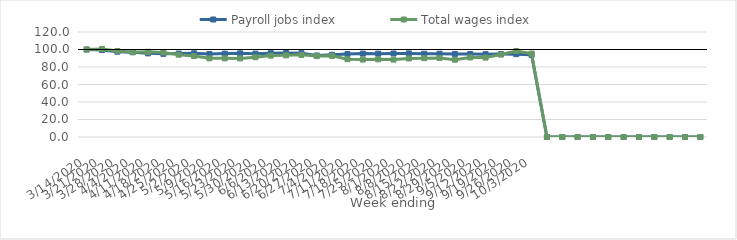
| Category | Payroll jobs index | Total wages index |
|---|---|---|
| 14/03/2020 | 100 | 100 |
| 21/03/2020 | 99.359 | 100.666 |
| 28/03/2020 | 97.508 | 98.218 |
| 04/04/2020 | 96.931 | 96.989 |
| 11/04/2020 | 95.594 | 97.424 |
| 18/04/2020 | 95.026 | 96.581 |
| 25/04/2020 | 95.434 | 94.1 |
| 02/05/2020 | 95.675 | 92.586 |
| 09/05/2020 | 94.839 | 89.883 |
| 16/05/2020 | 95.298 | 89.877 |
| 23/05/2020 | 95.611 | 89.812 |
| 30/05/2020 | 95.277 | 91.157 |
| 06/06/2020 | 95.81 | 93.004 |
| 13/06/2020 | 96.077 | 93.3 |
| 20/06/2020 | 95.834 | 93.88 |
| 27/06/2020 | 93.189 | 92.509 |
| 04/07/2020 | 93.992 | 92.741 |
| 11/07/2020 | 94.724 | 88.903 |
| 18/07/2020 | 95.302 | 88.489 |
| 25/07/2020 | 95.236 | 88.782 |
| 01/08/2020 | 95.443 | 88.443 |
| 08/08/2020 | 95.529 | 89.703 |
| 15/08/2020 | 95.123 | 90.11 |
| 22/08/2020 | 95.174 | 90.331 |
| 29/08/2020 | 94.91 | 88.315 |
| 05/09/2020 | 94.827 | 90.9 |
| 12/09/2020 | 94.639 | 90.734 |
| 19/09/2020 | 94.815 | 94.2 |
| 26/09/2020 | 94.663 | 98.27 |
| 03/10/2020 | 93.911 | 95.387 |